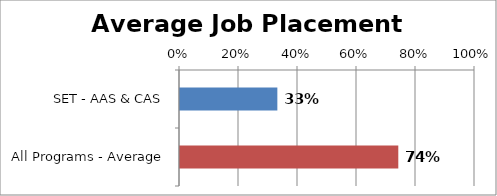
| Category | Series 0 |
|---|---|
| SET - AAS & CAS | 0.33 |
| All Programs - Average | 0.74 |